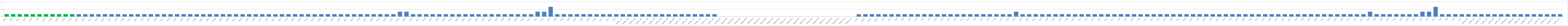
| Category | Series 0 |
|---|---|
| AW01 | 1 |
| AW02 | 1 |
| AW03 | 1 |
| AW04 | 1 |
| AW05 | 1 |
| AW06 | 1 |
| AW07 | 1 |
| AW08 | 1 |
| AW09 | 1 |
| AW10 | 1 |
| AW11 | 1 |
| AW12 | 1 |
| AW13 | 1 |
| AW14 | 1 |
| AW15 | 1 |
| AW16 | 1 |
| AW17 | 1 |
| AW18 | 1 |
| AW19 | 1 |
| AW20 | 1 |
| AW21 | 1 |
| AW22 | 1 |
| AW23 | 1 |
| AW24 | 1 |
| AW25 | 1 |
| AW26 | 1 |
| AW27 | 1 |
| AW28 | 1 |
| AW29 | 1 |
| BW01 | 1 |
| BW02 | 1 |
| BW03 | 1 |
| BWO4 | 1 |
| BW05 | 1 |
| BW06 | 1 |
| BW07 | 1 |
| BW08 | 1 |
| BW09 | 1 |
| BW10 | 1 |
| BW11 | 1 |
| BW12 | 1 |
| BW13 | 1 |
| BW14 | 1 |
| BW15 | 1 |
| BW16 | 1 |
| BW17 | 1 |
| BW18 | 1 |
| BW19 | 1 |
| BW20 | 1 |
| BW21 | 1 |
| BW22 | 1 |
| BW23 | 1 |
| BW24 | 1 |
| BW25 | 1 |
| BW26 | 1 |
| BW27 | 1 |
| BW28 | 1 |
| BW29 | 1 |
| BW30 | 1 |
| BW31 | 1 |
| BW32 | 2 |
| BW33 | 2 |
| BW34 | 1 |
| BW35 | 1 |
| BW36 | 1 |
| BW37 | 1 |
| BW38 | 1 |
| BW39 | 1 |
| BW40 | 1 |
| BW41 | 1 |
| BW42 | 1 |
| BW43 | 1 |
| BW44 | 1 |
| BW45 | 1 |
| BW46 | 1 |
| BW47 | 1 |
| BW48 | 1 |
| BW49 | 1 |
| BW50 | 1 |
| BW51 | 1 |
| BW52 | 1 |
| CW01 | 2 |
| CW02 | 2 |
| CW03 | 4 |
| CW04 | 1 |
| CW05 | 1 |
| CW06 | 1 |
| CW07 | 1 |
| CW08 | 1 |
| CW09 | 1 |
| CW10 | 1 |
| CW11 | 1 |
| CW12 | 1 |
| CW13 | 1 |
| AUMED. W01 | 1 |
| AUMED. W02 | 1 |
| AUMED. W03 | 1 |
| AUMED. W04 | 1 |
| AUMED. W05 | 1 |
| AUMED. W06 | 1 |
| AUMED. W07 | 1 |
| AUMED. W08 | 1 |
| AUMED.W09 | 1 |
| AUMED. W10 | 1 |
| AUMED. W11 | 1 |
| AUMED. W12 | 1 |
| AUMED. W13 | 1 |
| AUMED. W14 | 1 |
| AUMED. W15 | 1 |
| BUMED.W01 | 0 |
| BUMED.W02 | 0 |
| BUMED.W03 | 0 |
| BUMED.W04 | 0 |
| BUMED.W05 | 0 |
| BUMED.W06 | 0 |
| BUMED.W07 | 0 |
| BUMED.W08 | 0 |
| BUMED.W09 | 0 |
| BUMED.W10 | 0 |
| BUMED.W11 | 0 |
| BUMED.W12 | 0 |
| BUMED.W13 | 0 |
| BUMED.W14 | 0 |
| BUMED.W15 | 0 |
| BUMED.W16 | 0 |
| BUMED.W17 | 0 |
| BUMED.W18 | 0 |
| BUMED.W19 | 0 |
| BUMED.W20 | 0 |
| BUMED.W21 | 0 |
| AW22* | 1 |
| AW23* | 1 |
| AW24* | 1 |
| AW25* | 1 |
| AU01 | 1 |
| AU02 | 1 |
| AU03 | 1 |
| AU04 | 1 |
| AU05 | 1 |
| AU06 | 1 |
| AU07 | 1 |
| AU08 | 1 |
| AU09 | 1 |
| AU10 | 1 |
| AU11 | 1 |
| AU12 | 1 |
| AU13 | 1 |
| AU14 | 1 |
| AU15 | 1 |
| AU16 | 1 |
| AU17 | 1 |
| AU18 | 1 |
| AU19 | 1 |
| AU20 | 1 |
| AU21 | 2 |
| BU01 | 1 |
| BU02 | 1 |
| BU03 | 1 |
| BU04 | 1 |
| BU05 | 1 |
| BU06 | 1 |
| BU07 | 1 |
| BU08 | 1 |
| BU09 | 1 |
| BU10 | 1 |
| BU11 | 1 |
| BU12 | 1 |
| BU13 | 1 |
| BU14 | 1 |
| BU15 | 1 |
| BU16 | 1 |
| BU17 | 1 |
| BU18 | 1 |
| BU19 | 1 |
| BU20 | 1 |
| BU21 | 1 |
| BU22 | 1 |
| BU23 | 1 |
| BU24 | 1 |
| BU25 | 1 |
| BU26 | 1 |
| BU27 | 1 |
| BU28 | 1 |
| BU29 | 1 |
| BU30 | 1 |
| BU31 | 1 |
| BU32 | 1 |
| BU33 | 1 |
| BU34 | 1 |
| BU35 | 1 |
| BU36 | 1 |
| BU37 | 1 |
| BU38 | 1 |
| BU39 | 1 |
| BU40 | 1 |
| BU41 | 1 |
| BU42 | 1 |
| BU43 | 1 |
| BU44 | 1 |
| BU45 | 1 |
| BU46 | 1 |
| BU47 | 1 |
| BU48 | 1 |
| BU49 | 1 |
| BU50 | 1 |
| BU51 | 1 |
| BU52 | 1 |
| BU53 | 1 |
| BU54 | 2 |
| BU55 | 1 |
| BU56 | 1 |
| BU57 | 1 |
| BU58 | 1 |
| BU59 | 1 |
| BU60 | 1 |
| BU61 | 1 |
| CU01 | 2 |
| CU02 | 2 |
| CU03 | 4 |
| CU04 | 1 |
| CU05 | 1 |
| CU06 | 1 |
| CU07 | 1 |
| AUMED.U01 | 1 |
| AUMED.U02 | 1 |
| AUMED.U03 | 1 |
| AUMED.U04 | 1 |
| AUMED.U05 | 1 |
| AUMED.U06 | 1 |
| AUMED.U07 | 1 |
| AUMED.U08 | 1 |
| AUMED.U09 | 1 |
| AUMED.U10 | 1 |
| AUMED.U11 | 1 |
| AUMED.U12 | 1 |
| AUMED.U13 | 1 |
| AUMED.U14 | 1 |
| AUMED.U15 | 1 |